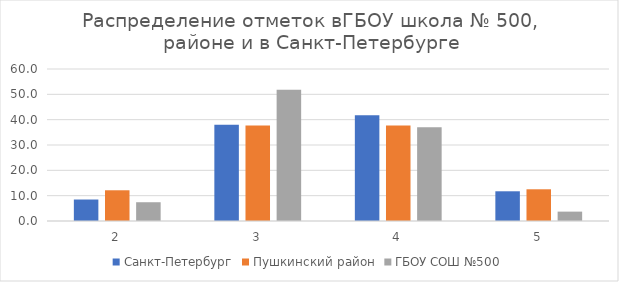
| Category | Санкт-Петербург | Пушкинский район | ГБОУ СОШ №500 |
|---|---|---|---|
| 2.0 | 8.48 | 12.13 | 7.41 |
| 3.0 | 38.03 | 37.68 | 51.85 |
| 4.0 | 41.77 | 37.68 | 37.04 |
| 5.0 | 11.73 | 12.52 | 3.7 |